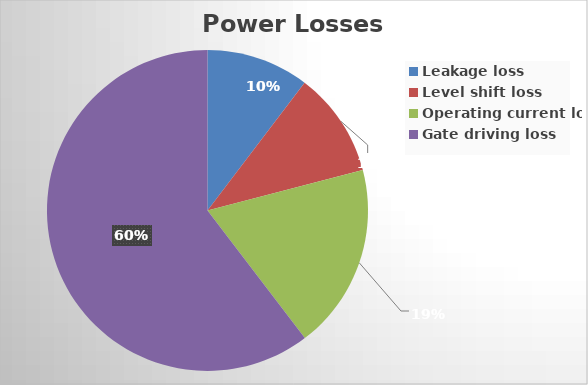
| Category | Series 0 |
|---|---|
| Leakage loss | 16.44 |
| Level shift loss | 16.851 |
| Operating current loss | 29.725 |
| Gate driving loss | 96 |